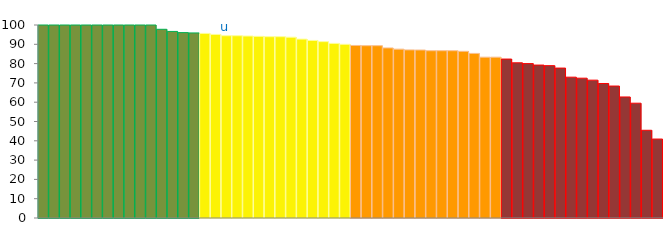
| Category | Top Quartile | 2nd Quartile | 3rd Quartile | Bottom Quartile | Series 4 |
|---|---|---|---|---|---|
|  | 100 | 0 | 0 | 0 | 100 |
|  | 100 | 0 | 0 | 0 | 100 |
|  | 100 | 0 | 0 | 0 | 100 |
|  | 100 | 0 | 0 | 0 | 100 |
|  | 100 | 0 | 0 | 0 | 100 |
|  | 100 | 0 | 0 | 0 | 100 |
|  | 100 | 0 | 0 | 0 | 100 |
|  | 100 | 0 | 0 | 0 | 100 |
|  | 100 | 0 | 0 | 0 | 100 |
|  | 100 | 0 | 0 | 0 | 100 |
|  | 100 | 0 | 0 | 0 | 100 |
|  | 97.778 | 0 | 0 | 0 | 97.778 |
|  | 96.667 | 0 | 0 | 0 | 96.667 |
|  | 96.053 | 0 | 0 | 0 | 96.053 |
|  | 95.89 | 0 | 0 | 0 | 95.89 |
|  | 0 | 95.652 | 0 | 0 | 95.652 |
|  | 0 | 95.122 | 0 | 0 | 95.122 |
| u | 0 | 94.444 | 0 | 0 | 94.444 |